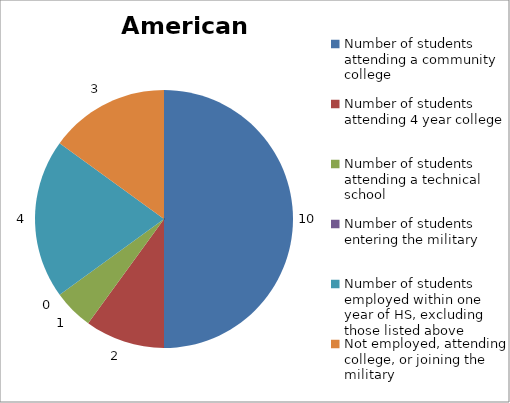
| Category | American Indian |
|---|---|
| Number of students attending a community college | 10 |
| Number of students attending 4 year college | 2 |
| Number of students attending a technical school | 1 |
| Number of students entering the military | 0 |
| Number of students employed within one year of HS, excluding those listed above | 4 |
| Not employed, attending college, or joining the military | 3 |